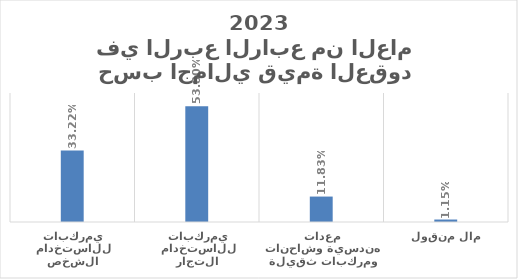
| Category | Series 0 |
|---|---|
| مركبات للاستخدام الشخصي  | 0.332 |
| مركبات للاستخدام التجاري  | 0.538 |
| معدات هندسية وشاحنات ومركبات ثقيلة | 0.118 |
| مال منقول | 0.011 |